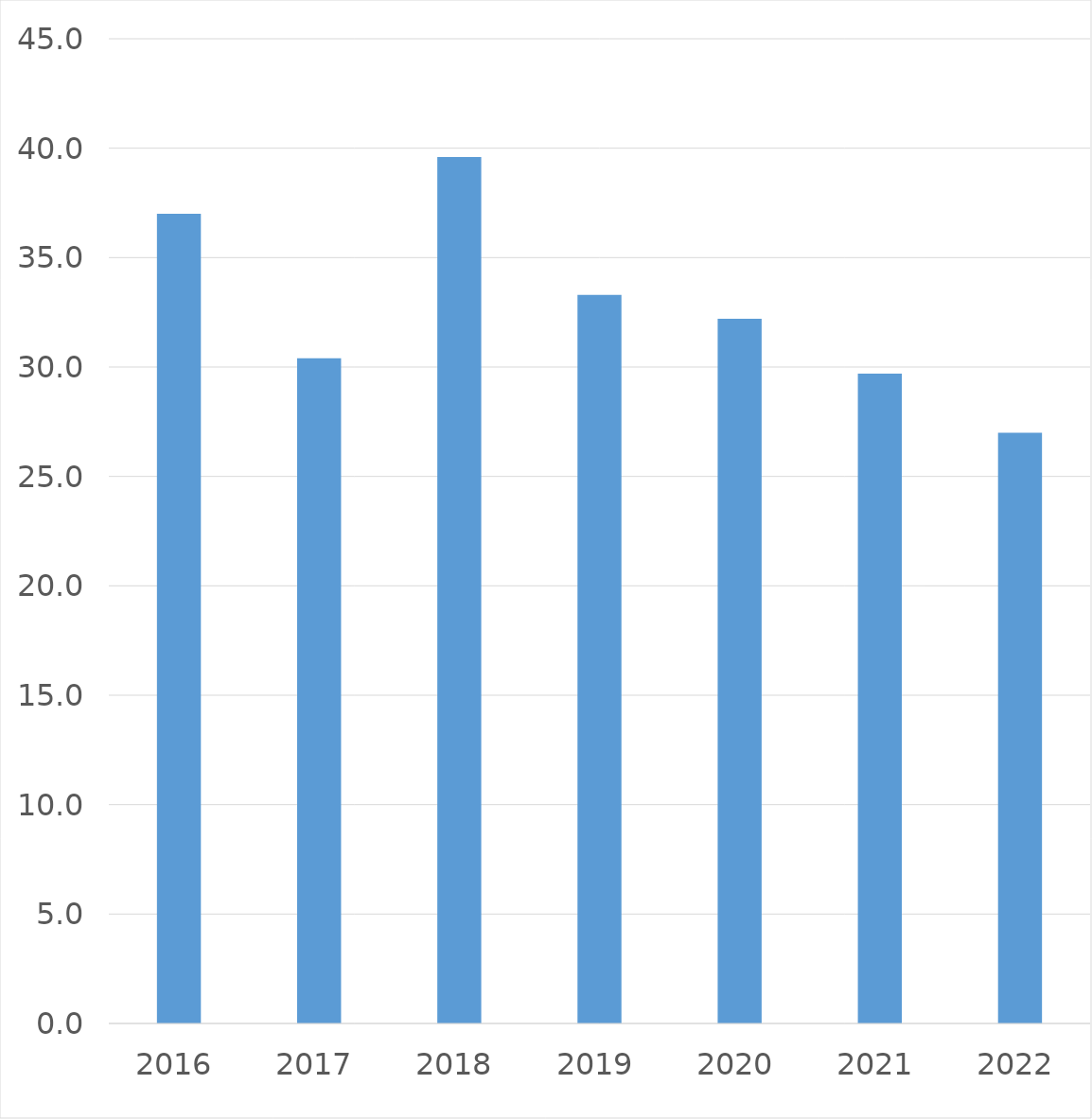
| Category | Series 0 |
|---|---|
| 2016 | 37 |
| 2017 | 30.4 |
| 2018 | 39.6 |
| 2019 | 33.3 |
| 2020 | 32.2 |
| 2021 | 29.7 |
| 2022 | 27 |